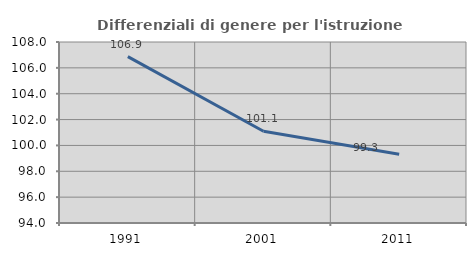
| Category | Differenziali di genere per l'istruzione superiore |
|---|---|
| 1991.0 | 106.871 |
| 2001.0 | 101.092 |
| 2011.0 | 99.321 |